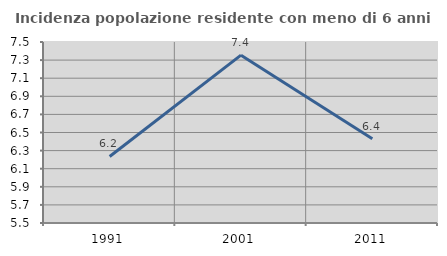
| Category | Incidenza popolazione residente con meno di 6 anni |
|---|---|
| 1991.0 | 6.235 |
| 2001.0 | 7.355 |
| 2011.0 | 6.432 |